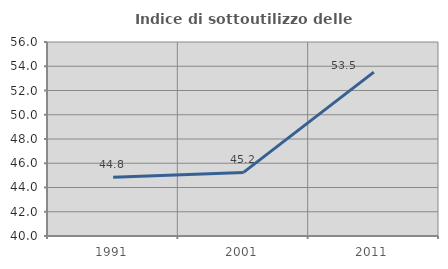
| Category | Indice di sottoutilizzo delle abitazioni  |
|---|---|
| 1991.0 | 44.838 |
| 2001.0 | 45.245 |
| 2011.0 | 53.511 |